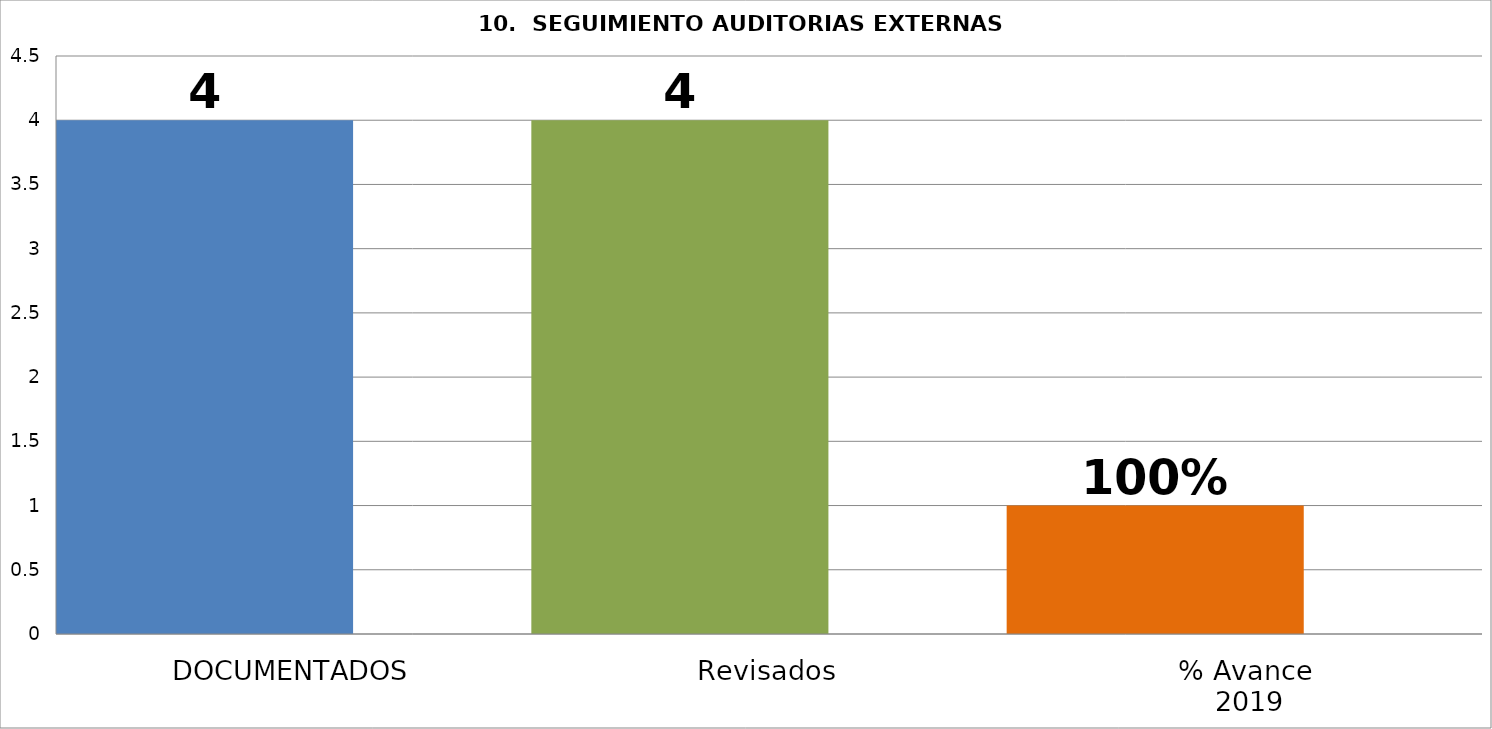
| Category | Series 2 | Series 4 | Series 0 | Series 1 | Series 5 |
|---|---|---|---|---|---|
| DOCUMENTADOS | 4 |  |  |  |  |
| Revisados | 4 |  |  |  |  |
| % Avance
 2019 | 1 |  |  |  |  |